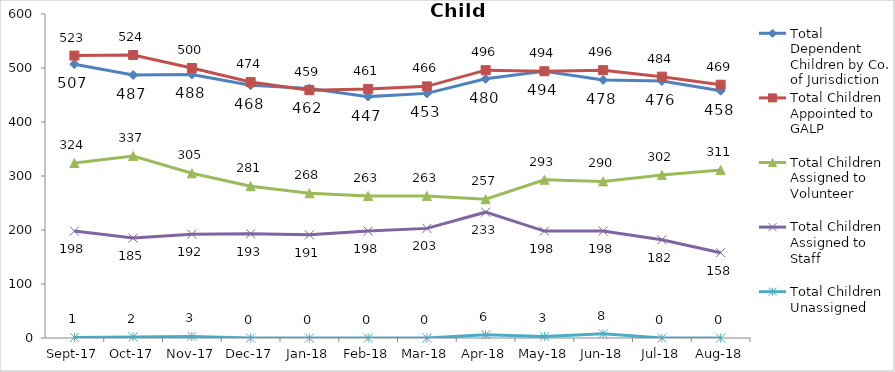
| Category | Total Dependent Children by Co. of Jurisdiction | Total Children Appointed to GALP | Total Children Assigned to Volunteer | Total Children Assigned to Staff | Total Children Unassigned |
|---|---|---|---|---|---|
| 2017-09-01 | 507 | 523 | 324 | 198 | 1 |
| 2017-10-01 | 487 | 524 | 337 | 185 | 2 |
| 2017-11-01 | 488 | 500 | 305 | 192 | 3 |
| 2017-12-01 | 468 | 474 | 281 | 193 | 0 |
| 2018-01-01 | 462 | 459 | 268 | 191 | 0 |
| 2018-02-01 | 447 | 461 | 263 | 198 | 0 |
| 2018-03-01 | 453 | 466 | 263 | 203 | 0 |
| 2018-04-01 | 480 | 496 | 257 | 233 | 6 |
| 2018-05-01 | 494 | 494 | 293 | 198 | 3 |
| 2018-06-01 | 478 | 496 | 290 | 198 | 8 |
| 2018-07-01 | 476 | 484 | 302 | 182 | 0 |
| 2018-08-01 | 458 | 469 | 311 | 158 | 0 |